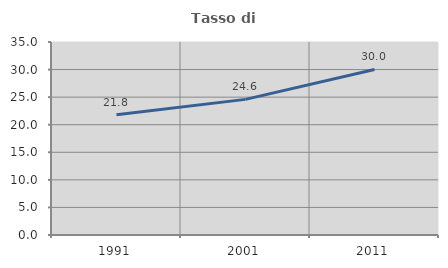
| Category | Tasso di occupazione   |
|---|---|
| 1991.0 | 21.811 |
| 2001.0 | 24.594 |
| 2011.0 | 30.025 |